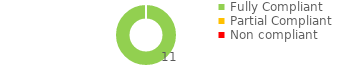
| Category | Series 0 |
|---|---|
| Fully Compliant | 11 |
| Partial Compliant | 0 |
| Non compliant | 0 |